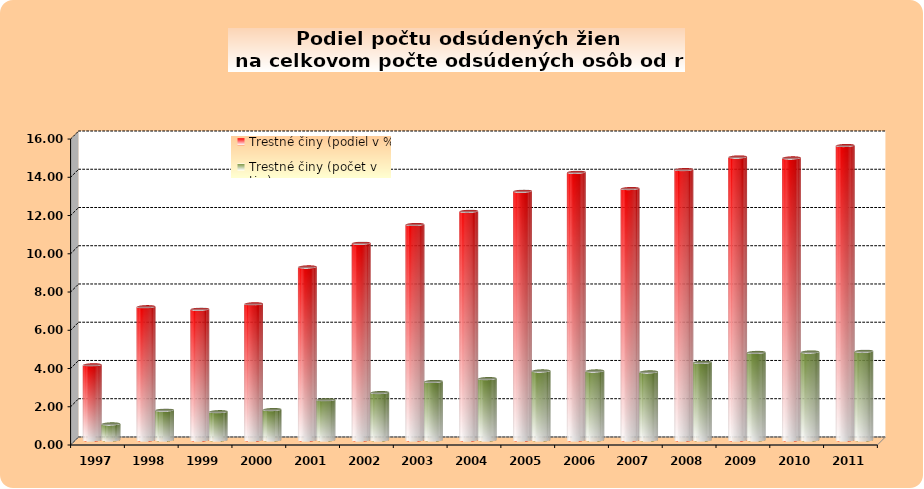
| Category | Trestné činy (podiel v %) | Trestné činy (počet v tis.) |
|---|---|---|
| 1997.0 | 3.93 | 0.84 |
| 1998.0 | 6.97 | 1.56 |
| 1999.0 | 6.84 | 1.48 |
| 2000.0 | 7.12 | 1.59 |
| 2001.0 | 9.05 | 2.1 |
| 2002.0 | 10.29 | 2.48 |
| 2003.0 | 11.27 | 3.06 |
| 2004.0 | 11.96 | 3.21 |
| 2005.0 | 13.01 | 3.61 |
| 2006.0 | 14 | 3.61 |
| 2007.0 | 13.15 | 3.56 |
| 2008.0 | 14.14 | 4.06 |
| 2009.0 | 14.8 | 4.58 |
| 2010.0 | 14.75 | 4.6 |
| 2011.0 | 15.4 | 4.64 |